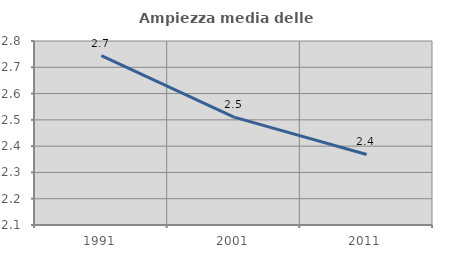
| Category | Ampiezza media delle famiglie |
|---|---|
| 1991.0 | 2.744 |
| 2001.0 | 2.51 |
| 2011.0 | 2.368 |